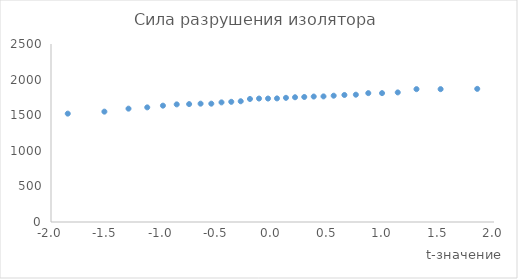
| Category | Сила разрушения изолятора |
|---|---|
| -1.8485962885014084 | 1522 |
| -1.5179291595942785 | 1550 |
| -1.3001534333634226 | 1592 |
| -1.1309776082451586 | 1610 |
| -0.9891686273406355 | 1634 |
| -0.8648943586852825 | 1652 |
| -0.75272879425817 | 1656 |
| -0.6493239131864658 | 1662 |
| -0.5524425846467743 | 1662 |
| -0.4604945391031162 | 1680 |
| -0.372289360465191 | 1688 |
| -0.2868939169230393 | 1696 |
| -0.20354423153248621 | 1728 |
| -0.12158738275048304 | 1734 |
| -0.04044050856564621 | 1734 |
| 0.04044050856564621 | 1736 |
| 0.1215873827504829 | 1744 |
| 0.20354423153248635 | 1752 |
| 0.2868939169230393 | 1756 |
| 0.372289360465191 | 1762 |
| 0.460494539103116 | 1764 |
| 0.5524425846467745 | 1774 |
| 0.6493239131864658 | 1784 |
| 0.75272879425817 | 1788 |
| 0.8648943586852835 | 1810 |
| 0.9891686273406355 | 1810 |
| 1.1309776082451586 | 1820 |
| 1.3001534333634226 | 1866 |
| 1.5179291595942783 | 1866 |
| 1.848596288501409 | 1870 |